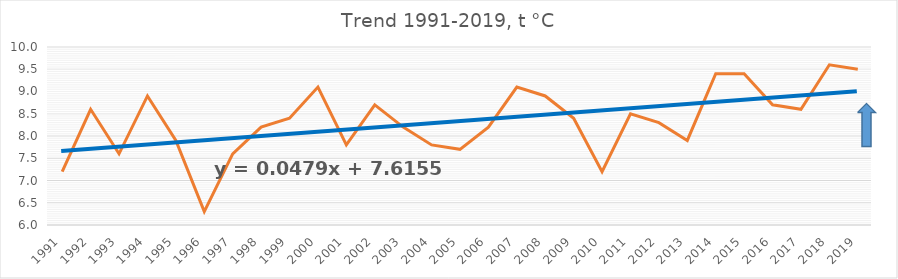
| Category | Series 1 |
|---|---|
| 1991.0 | 7.2 |
| 1992.0 | 8.6 |
| 1993.0 | 7.6 |
| 1994.0 | 8.9 |
| 1995.0 | 7.9 |
| 1996.0 | 6.3 |
| 1997.0 | 7.6 |
| 1998.0 | 8.2 |
| 1999.0 | 8.4 |
| 2000.0 | 9.1 |
| 2001.0 | 7.8 |
| 2002.0 | 8.7 |
| 2003.0 | 8.2 |
| 2004.0 | 7.8 |
| 2005.0 | 7.7 |
| 2006.0 | 8.2 |
| 2007.0 | 9.1 |
| 2008.0 | 8.9 |
| 2009.0 | 8.4 |
| 2010.0 | 7.2 |
| 2011.0 | 8.5 |
| 2012.0 | 8.3 |
| 2013.0 | 7.9 |
| 2014.0 | 9.4 |
| 2015.0 | 9.4 |
| 2016.0 | 8.7 |
| 2017.0 | 8.6 |
| 2018.0 | 9.6 |
| 2019.0 | 9.5 |